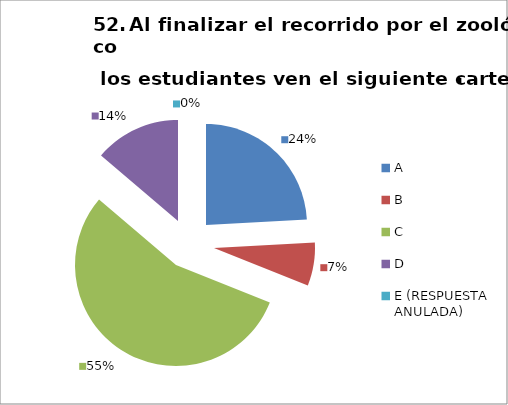
| Category | CANTIDAD DE RESPUESTAS PREGUNTA (52) | PORCENTAJE |
|---|---|---|
| A | 7 | 0.241 |
| B | 2 | 0.069 |
| C | 16 | 0.552 |
| D | 4 | 0.138 |
| E (RESPUESTA ANULADA) | 0 | 0 |